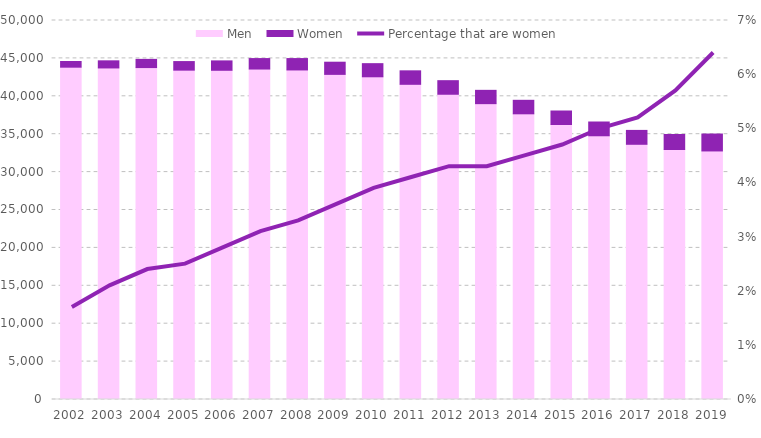
| Category | Men | Women |
|---|---|---|
| 2002.0 | 43841 | 753 |
| 2003.0 | 43741 | 938 |
| 2004.0 | 43790 | 1081 |
| 2005.0 | 43450 | 1132 |
| 2006.0 | 43432 | 1239 |
| 2007.0 | 43596 | 1382 |
| 2008.0 | 43476 | 1502 |
| 2009.0 | 42893 | 1605 |
| 2010.0 | 42574 | 1733 |
| 2011.0 | 41582 | 1778 |
| 2012.0 | 40271 | 1791 |
| 2013.0 | 39030 | 1756 |
| 2014.0 | 37690 | 1782 |
| 2015.0 | 36278 | 1783 |
| 2016.0 | 34793 | 1817 |
| 2017.0 | 33669 | 1832 |
| 2018.0 | 32982 | 1980 |
| 2019.0 | 32791 | 2231 |